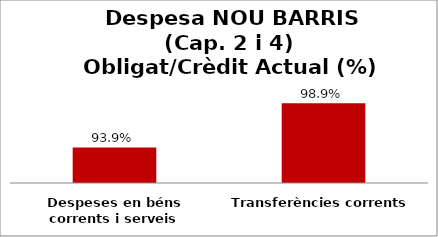
| Category | Series 0 |
|---|---|
| Despeses en béns corrents i serveis | 0.939 |
| Transferències corrents | 0.989 |